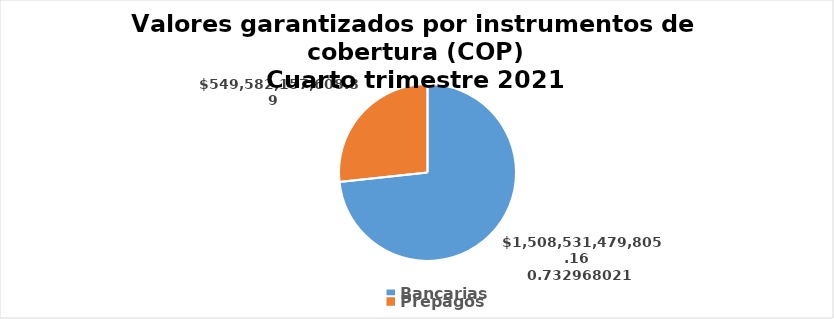
| Category | Series 0 |
|---|---|
| Bancarias | 1508531479805.16 |
| Prepagos | 549582157608.89 |